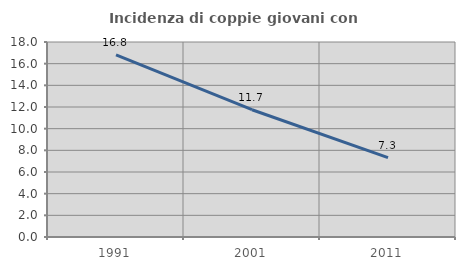
| Category | Incidenza di coppie giovani con figli |
|---|---|
| 1991.0 | 16.803 |
| 2001.0 | 11.749 |
| 2011.0 | 7.321 |